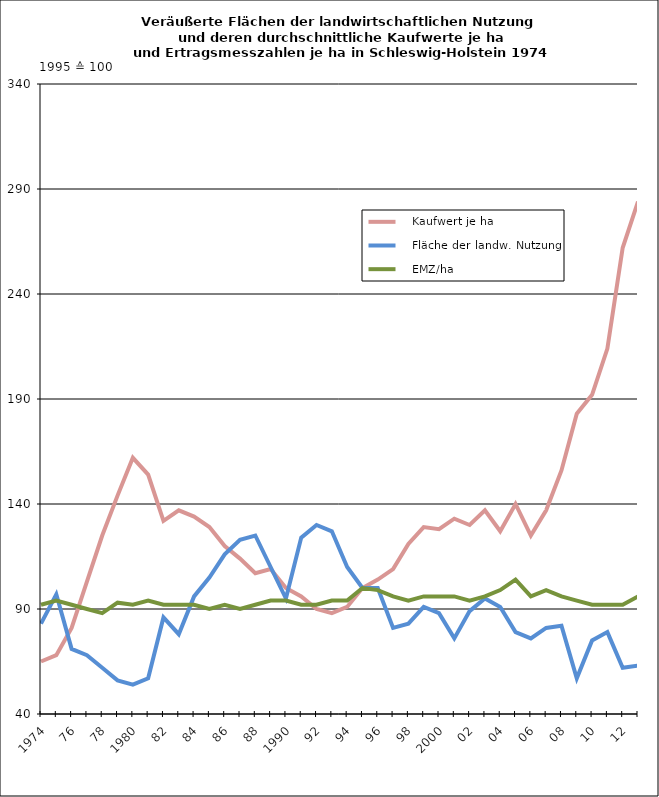
| Category |    Kaufwert je ha |    Fläche der landw. Nutzung |    EMZ/ha |
|---|---|---|---|
| 1974.0 | 65 | 83 | 92 |
| 75.0 | 68 | 97 | 94 |
| 76.0 | 81 | 71 | 92 |
| 77.0 | 103 | 68 | 90 |
| 78.0 | 125 | 62 | 88 |
| 79.0 | 144 | 56 | 93 |
| 1980.0 | 162 | 54 | 92 |
| 81.0 | 154 | 57 | 94 |
| 82.0 | 132 | 86 | 92 |
| 83.0 | 137 | 78 | 92 |
| 84.0 | 134 | 96 | 92 |
| 85.0 | 129 | 105 | 90 |
| 86.0 | 120 | 116 | 92 |
| 87.0 | 114 | 123 | 90 |
| 88.0 | 107 | 125 | 92 |
| 89.0 | 109 | 110 | 94 |
| 1990.0 | 100 | 95 | 94 |
| 91.0 | 96 | 124 | 92 |
| 92.0 | 90 | 130 | 92 |
| 93.0 | 88 | 127 | 94 |
| 94.0 | 91 | 110 | 94 |
| 95.0 | 100 | 100 | 100 |
| 96.0 | 104 | 100 | 99 |
| 97.0 | 109 | 81 | 96 |
| 98.0 | 121 | 83 | 94 |
| 99.0 | 129 | 91 | 96 |
| 2000.0 | 128 | 88 | 96 |
| 1.0 | 133 | 76 | 96 |
| 2.0 | 130 | 89 | 94 |
| 3.0 | 137 | 95 | 96 |
| 4.0 | 127 | 91 | 99 |
| 5.0 | 140 | 79 | 104 |
| 6.0 | 125 | 76 | 96 |
| 7.0 | 137 | 81 | 99 |
| 8.0 | 156 | 82 | 96 |
| 9.0 | 183 | 57 | 94 |
| 10.0 | 192 | 75 | 92 |
| 11.0 | 214 | 79 | 92 |
| 12.0 | 262 | 62 | 92 |
| 13.0 | 284 | 63 | 96 |